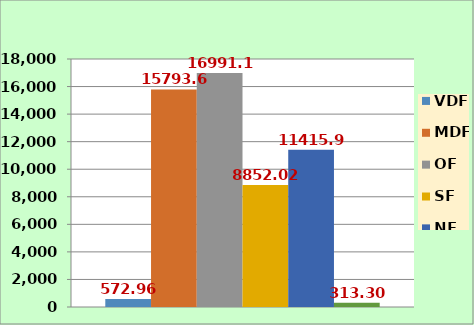
| Category | VDF  | MDF  | OF  | SF  | NF  | WB  |
|---|---|---|---|---|---|---|
| Total | 572.96 | 15793.68 | 16991.18 | 8852.02 | 11415.96 | 313.3 |